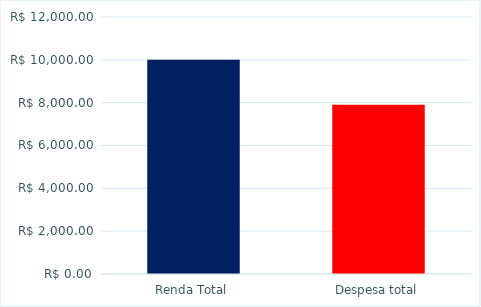
| Category | Series 0 |
|---|---|
| Renda Total | 10000 |
| Despesa total | 7900 |